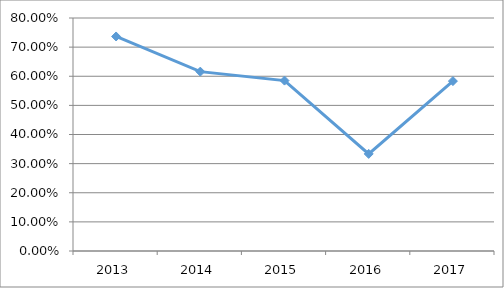
| Category | SIEK-N9O10 |
|---|---|
| 2013.0 | 0.737 |
| 2014.0 | 0.616 |
| 2015.0 | 0.585 |
| 2016.0 | 0.333 |
| 2017.0 | 0.583 |